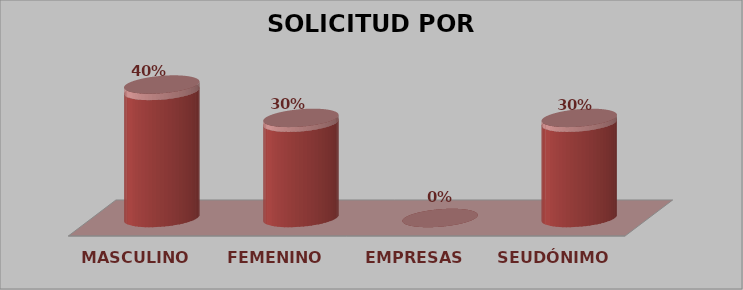
| Category | SOLICITUD POR GÉNERO | Series 1 |
|---|---|---|
| MASCULINO | 8 | 0.4 |
| FEMENINO | 6 | 0.3 |
| EMPRESAS | 0 | 0 |
| SEUDÓNIMO | 6 | 0.3 |